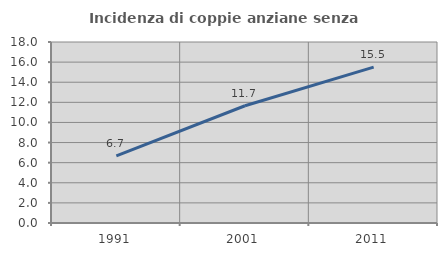
| Category | Incidenza di coppie anziane senza figli  |
|---|---|
| 1991.0 | 6.675 |
| 2001.0 | 11.658 |
| 2011.0 | 15.505 |